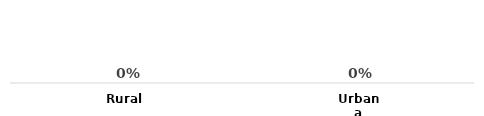
| Category | Series 0 |
|---|---|
| Rural | 0 |
| Urbana | 0 |